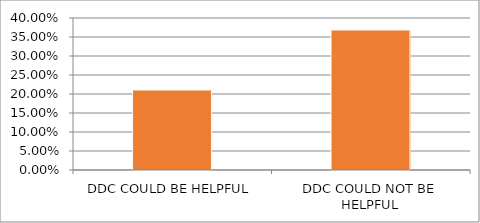
| Category | Series 0 |
|---|---|
| DDC COULD BE HELPFUL | 0.211 |
| DDC COULD NOT BE HELPFUL | 0.368 |